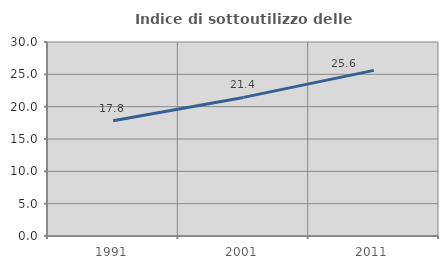
| Category | Indice di sottoutilizzo delle abitazioni  |
|---|---|
| 1991.0 | 17.816 |
| 2001.0 | 21.433 |
| 2011.0 | 25.613 |